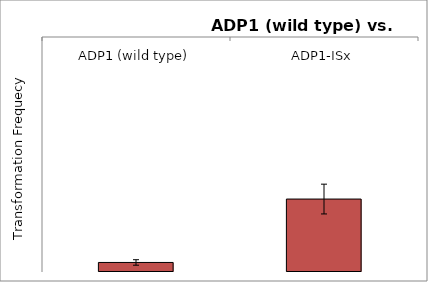
| Category | TF |
|---|---|
| ADP1 (wild type) | 0 |
| ADP1-ISx | 0 |